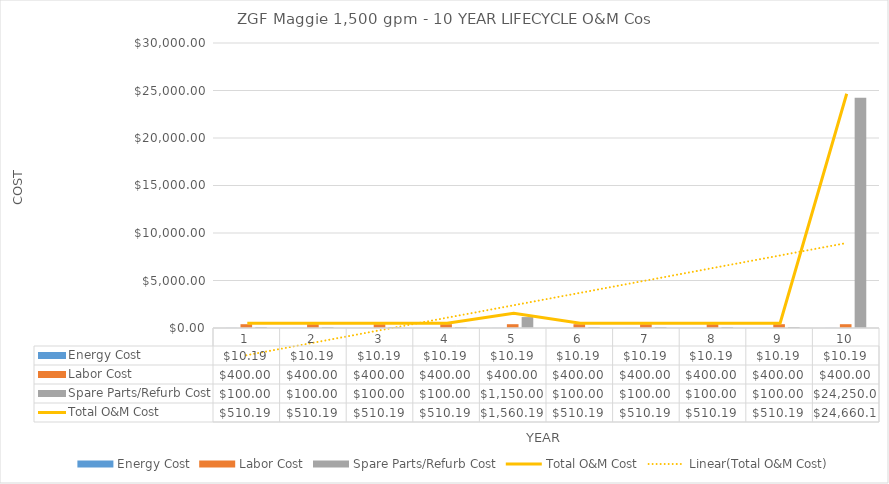
| Category | Energy Cost | Labor Cost | Spare Parts/Refurb Cost |
|---|---|---|---|
| 0 | 10.188 | 400 | 100 |
| 1 | 10.188 | 400 | 100 |
| 2 | 10.188 | 400 | 100 |
| 3 | 10.188 | 400 | 100 |
| 4 | 10.188 | 400 | 1150 |
| 5 | 10.188 | 400 | 100 |
| 6 | 10.188 | 400 | 100 |
| 7 | 10.188 | 400 | 100 |
| 8 | 10.188 | 400 | 100 |
| 9 | 10.188 | 400 | 24250 |